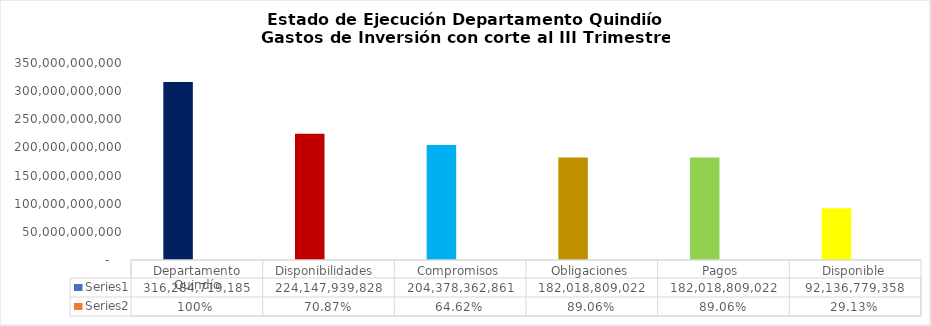
| Category | Series 0 | Series 1 |
|---|---|---|
| Departamento Quindío | 316284719185.49 | 1 |
| Disponibilidades  | 224147939827.924 | 0.709 |
| Compromisos | 204378362860.812 | 0.646 |
| Obligaciones | 182018809021.976 | 0.891 |
| Pagos  | 182018809021.976 | 0.891 |
| Disponible | 92136779357.566 | 0.291 |